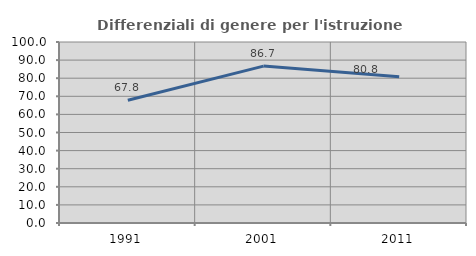
| Category | Differenziali di genere per l'istruzione superiore |
|---|---|
| 1991.0 | 67.843 |
| 2001.0 | 86.69 |
| 2011.0 | 80.765 |